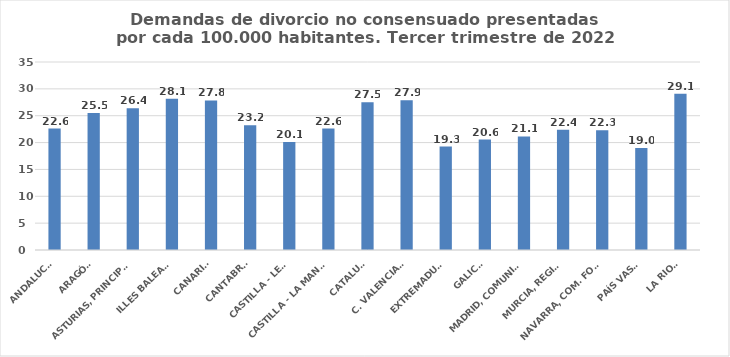
| Category | Series 0 |
|---|---|
| ANDALUCÍA | 22.616 |
| ARAGÓN | 25.503 |
| ASTURIAS, PRINCIPADO | 26.381 |
| ILLES BALEARS | 28.14 |
| CANARIAS | 27.844 |
| CANTABRIA | 23.239 |
| CASTILLA - LEÓN | 20.126 |
| CASTILLA - LA MANCHA | 22.61 |
| CATALUÑA | 27.508 |
| C. VALENCIANA | 27.874 |
| EXTREMADURA | 19.255 |
| GALICIA | 20.564 |
| MADRID, COMUNIDAD | 21.143 |
| MURCIA, REGIÓN | 22.397 |
| NAVARRA, COM. FORAL | 22.302 |
| PAÍS VASCO | 18.983 |
| LA RIOJA | 29.109 |